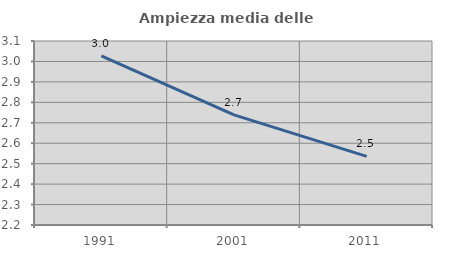
| Category | Ampiezza media delle famiglie |
|---|---|
| 1991.0 | 3.027 |
| 2001.0 | 2.739 |
| 2011.0 | 2.536 |